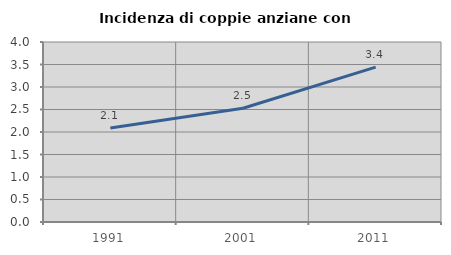
| Category | Incidenza di coppie anziane con figli |
|---|---|
| 1991.0 | 2.089 |
| 2001.0 | 2.527 |
| 2011.0 | 3.442 |